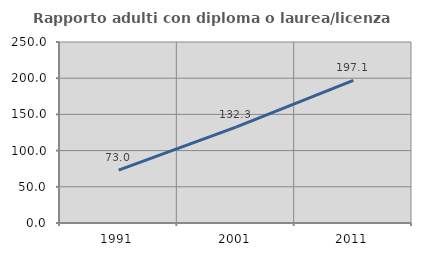
| Category | Rapporto adulti con diploma o laurea/licenza media  |
|---|---|
| 1991.0 | 73.025 |
| 2001.0 | 132.308 |
| 2011.0 | 197.064 |